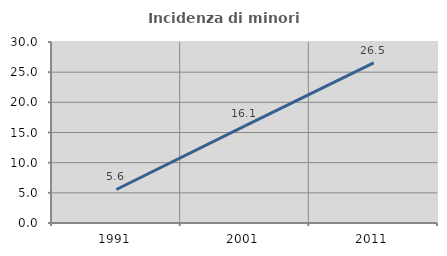
| Category | Incidenza di minori stranieri |
|---|---|
| 1991.0 | 5.556 |
| 2001.0 | 16.107 |
| 2011.0 | 26.542 |